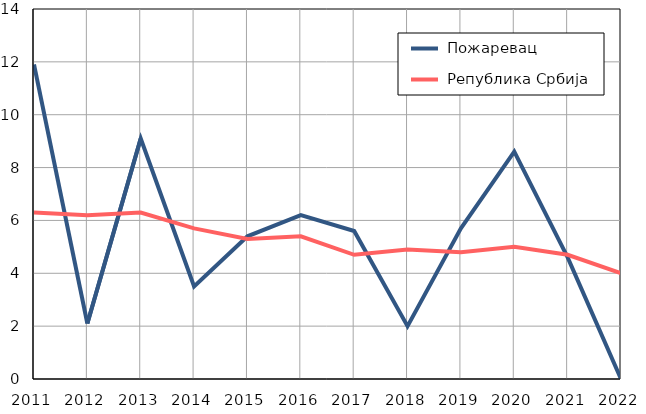
| Category |  Пожаревац |  Република Србија |
|---|---|---|
| 2011.0 | 11.9 | 6.3 |
| 2012.0 | 2.1 | 6.2 |
| 2013.0 | 9.1 | 6.3 |
| 2014.0 | 3.5 | 5.7 |
| 2015.0 | 5.4 | 5.3 |
| 2016.0 | 6.2 | 5.4 |
| 2017.0 | 5.6 | 4.7 |
| 2018.0 | 2 | 4.9 |
| 2019.0 | 5.7 | 4.8 |
| 2020.0 | 8.6 | 5 |
| 2021.0 | 4.6 | 4.7 |
| 2022.0 | 0 | 4 |